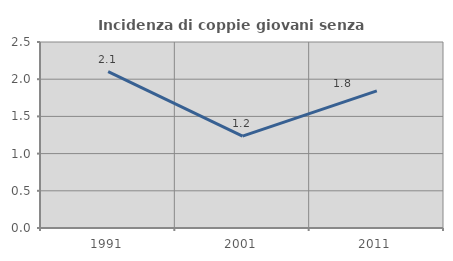
| Category | Incidenza di coppie giovani senza figli |
|---|---|
| 1991.0 | 2.101 |
| 2001.0 | 1.235 |
| 2011.0 | 1.843 |